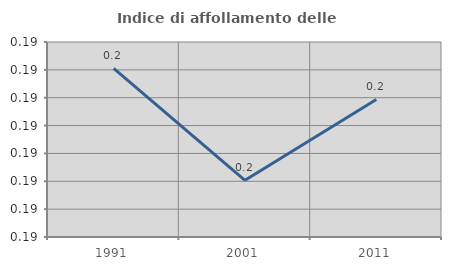
| Category | Indice di affollamento delle abitazioni  |
|---|---|
| 1991.0 | 0.193 |
| 2001.0 | 0.189 |
| 2011.0 | 0.192 |